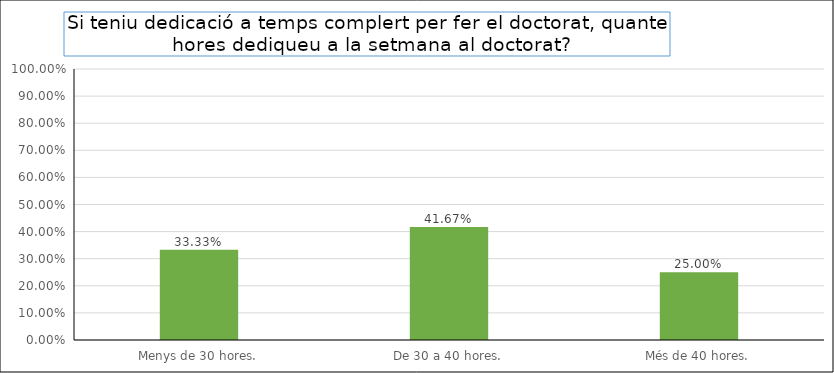
| Category | Series 0 |
|---|---|
| Menys de 30 hores. | 0.333 |
| De 30 a 40 hores. | 0.417 |
| Més de 40 hores. | 0.25 |